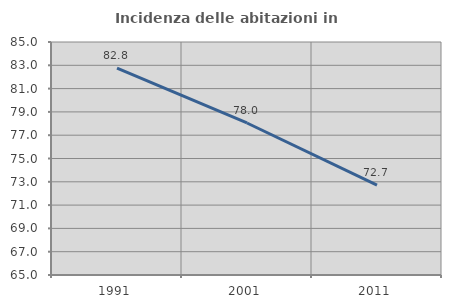
| Category | Incidenza delle abitazioni in proprietà  |
|---|---|
| 1991.0 | 82.755 |
| 2001.0 | 78.048 |
| 2011.0 | 72.707 |